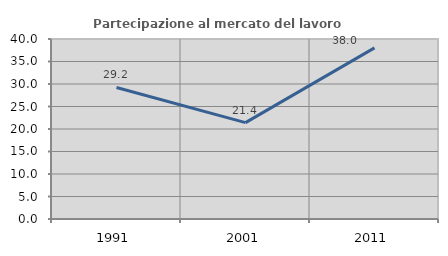
| Category | Partecipazione al mercato del lavoro  femminile |
|---|---|
| 1991.0 | 29.231 |
| 2001.0 | 21.409 |
| 2011.0 | 38.021 |